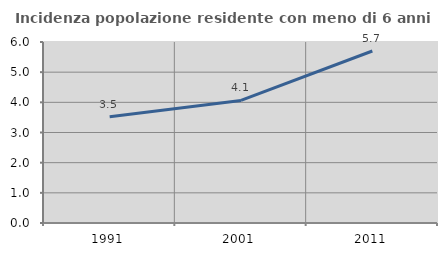
| Category | Incidenza popolazione residente con meno di 6 anni |
|---|---|
| 1991.0 | 3.526 |
| 2001.0 | 4.064 |
| 2011.0 | 5.702 |